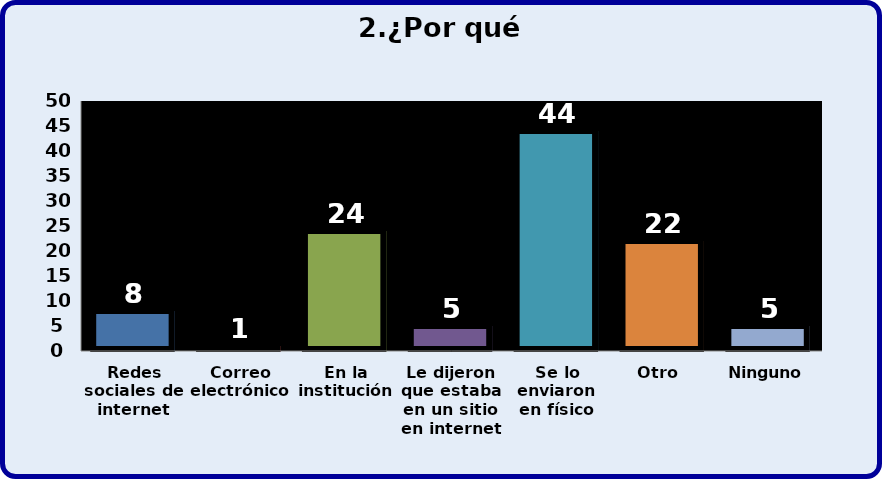
| Category | Series 0 |
|---|---|
| Redes sociales de internet | 8 |
| Correo electrónico | 1 |
| En la institución | 24 |
| Le dijeron que estaba en un sitio en internet | 5 |
| Se lo enviaron en físico | 44 |
| Otro  | 22 |
| Ninguno | 5 |